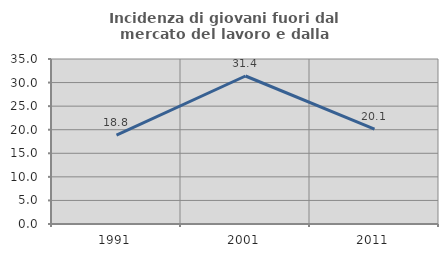
| Category | Incidenza di giovani fuori dal mercato del lavoro e dalla formazione  |
|---|---|
| 1991.0 | 18.841 |
| 2001.0 | 31.395 |
| 2011.0 | 20.144 |